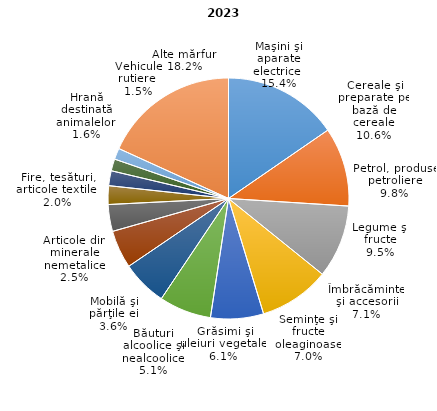
| Category | % |
|---|---|
| Maşini şi aparate electrice  | 15.4 |
| Cereale şi preparate pe bază de cereale | 10.6 |
| Petrol, produse petroliere | 9.8 |
| Legume şi fructe | 9.5 |
| Îmbrăcăminte şi accesorii | 7.1 |
| Seminţe şi fructe oleaginoase | 7 |
| Grăsimi şi uleiuri vegetale  | 6.1 |
| Băuturi alcoolice şi nealcoolice | 5.1 |
| Mobilă şi părţile ei | 3.6 |
| Articole din minerale nemetalice | 2.5 |
| Fire, tesături, articole textile  | 2 |
| Hrană destinată animalelor  | 1.6 |
| Vehicule rutiere  | 1.5 |
| Alte mărfuri | 18.2 |